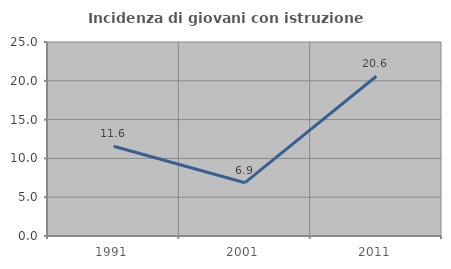
| Category | Incidenza di giovani con istruzione universitaria |
|---|---|
| 1991.0 | 11.57 |
| 2001.0 | 6.87 |
| 2011.0 | 20.588 |